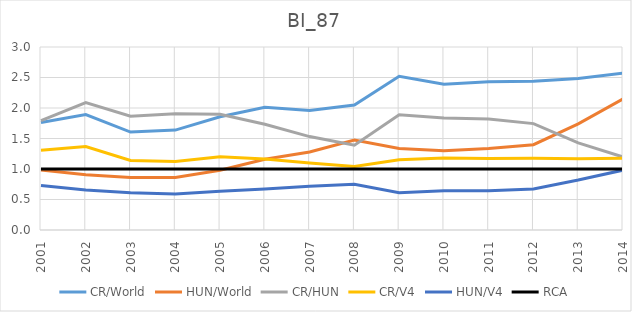
| Category | CR/World | HUN/World | CR/HUN | CR/V4 | HUN/V4 | RCA |
|---|---|---|---|---|---|---|
| 2001.0 | 1.762 | 0.982 | 1.794 | 1.308 | 0.729 | 1 |
| 2002.0 | 1.893 | 0.906 | 2.089 | 1.367 | 0.654 | 1 |
| 2003.0 | 1.606 | 0.86 | 1.866 | 1.138 | 0.61 | 1 |
| 2004.0 | 1.638 | 0.86 | 1.904 | 1.125 | 0.591 | 1 |
| 2005.0 | 1.856 | 0.979 | 1.896 | 1.202 | 0.634 | 1 |
| 2006.0 | 2.011 | 1.161 | 1.732 | 1.166 | 0.673 | 1 |
| 2007.0 | 1.958 | 1.279 | 1.531 | 1.099 | 0.718 | 1 |
| 2008.0 | 2.049 | 1.473 | 1.391 | 1.04 | 0.748 | 1 |
| 2009.0 | 2.521 | 1.335 | 1.888 | 1.151 | 0.61 | 1 |
| 2010.0 | 2.388 | 1.301 | 1.836 | 1.178 | 0.642 | 1 |
| 2011.0 | 2.432 | 1.336 | 1.821 | 1.171 | 0.643 | 1 |
| 2012.0 | 2.439 | 1.399 | 1.744 | 1.174 | 0.673 | 1 |
| 2013.0 | 2.485 | 1.739 | 1.428 | 1.17 | 0.819 | 1 |
| 2014.0 | 2.573 | 2.147 | 1.198 | 1.176 | 0.982 | 1 |